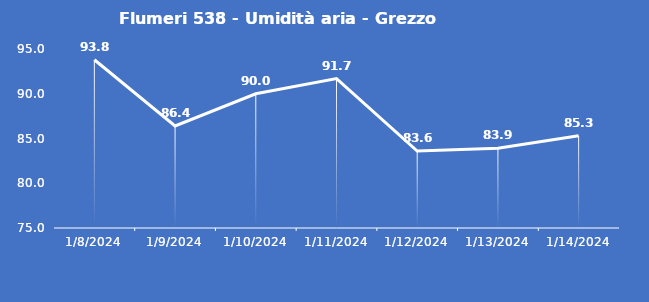
| Category | Flumeri 538 - Umidità aria - Grezzo (%) |
|---|---|
| 1/8/24 | 93.8 |
| 1/9/24 | 86.4 |
| 1/10/24 | 90 |
| 1/11/24 | 91.7 |
| 1/12/24 | 83.6 |
| 1/13/24 | 83.9 |
| 1/14/24 | 85.3 |